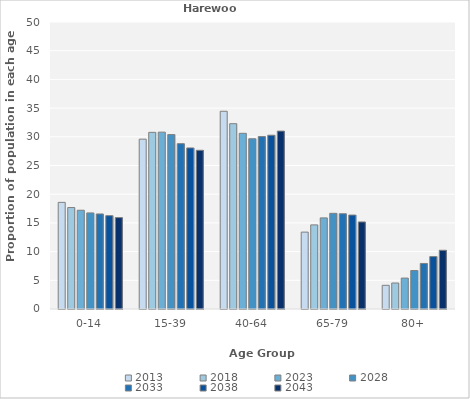
| Category | 2013 | 2018 | 2023 | 2028 | 2033 | 2038 | 2043 |
|---|---|---|---|---|---|---|---|
| 0-14 | 18.578 | 17.672 | 17.206 | 16.743 | 16.558 | 16.263 | 15.927 |
| 15-39 | 29.587 | 30.776 | 30.81 | 30.383 | 28.804 | 28.062 | 27.649 |
| 40-64 | 34.45 | 32.284 | 30.607 | 29.655 | 30.036 | 30.277 | 30.993 |
| 65-79 | 13.394 | 14.655 | 15.87 | 16.667 | 16.594 | 16.367 | 15.166 |
| 80+ | 4.128 | 4.526 | 5.385 | 6.705 | 7.935 | 9.135 | 10.232 |